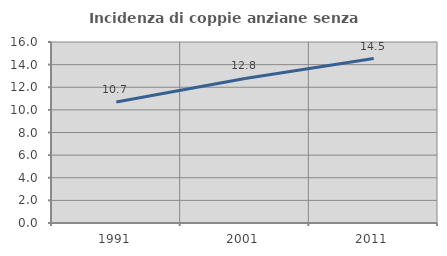
| Category | Incidenza di coppie anziane senza figli  |
|---|---|
| 1991.0 | 10.695 |
| 2001.0 | 12.778 |
| 2011.0 | 14.535 |